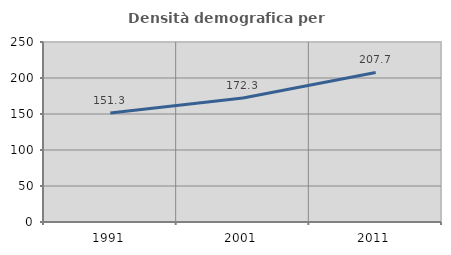
| Category | Densità demografica |
|---|---|
| 1991.0 | 151.294 |
| 2001.0 | 172.273 |
| 2011.0 | 207.67 |